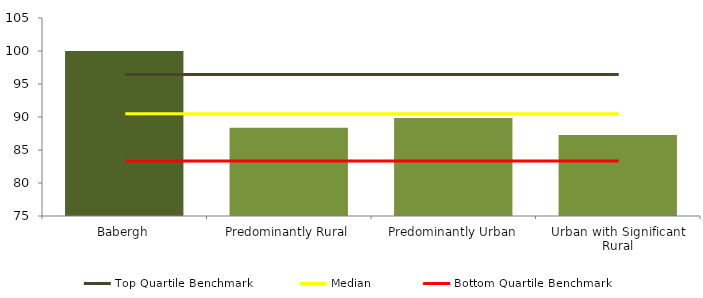
| Category | Series 0 |
|---|---|
| Babergh | 100 |
| Predominantly Rural | 88.362 |
| Predominantly Urban | 89.85 |
| Urban with Significant Rural | 87.289 |